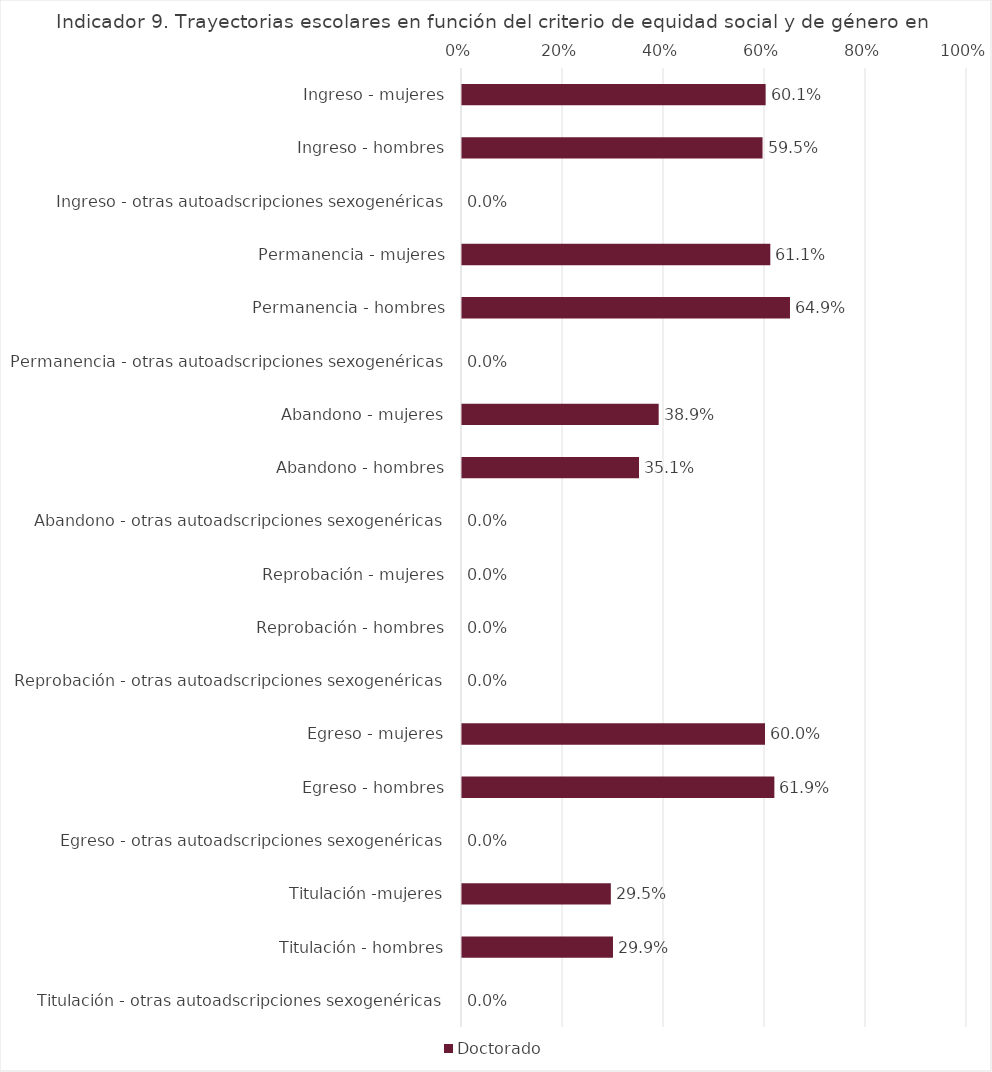
| Category | Doctorado |
|---|---|
| Ingreso - mujeres | 0.601 |
| Ingreso - hombres | 0.595 |
| Ingreso - otras autoadscripciones sexogenéricas | 0 |
| Permanencia - mujeres | 0.611 |
| Permanencia - hombres | 0.649 |
| Permanencia - otras autoadscripciones sexogenéricas | 0 |
| Abandono - mujeres | 0.389 |
| Abandono - hombres | 0.351 |
| Abandono - otras autoadscripciones sexogenéricas | 0 |
| Reprobación - mujeres | 0 |
| Reprobación - hombres | 0 |
| Reprobación - otras autoadscripciones sexogenéricas | 0 |
| Egreso - mujeres | 0.6 |
| Egreso - hombres | 0.619 |
| Egreso - otras autoadscripciones sexogenéricas | 0 |
| Titulación -mujeres | 0.295 |
| Titulación - hombres | 0.299 |
| Titulación - otras autoadscripciones sexogenéricas | 0 |